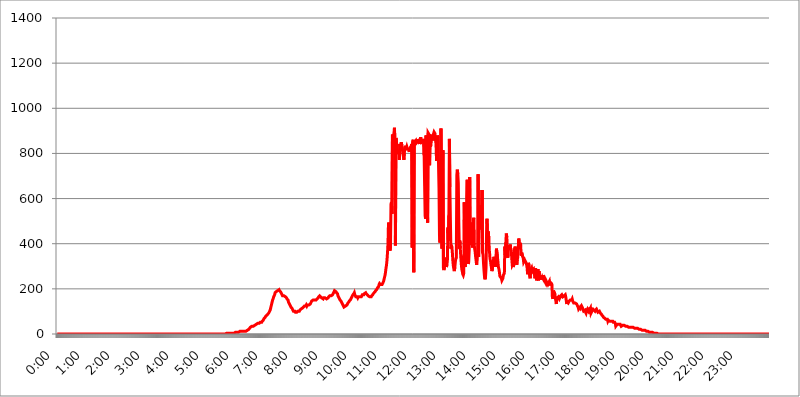
| Category | 2017.07.25. Intenzitás [W/m^2] |
|---|---|
| 0.0 | 0 |
| 0.0006944444444444445 | 0 |
| 0.001388888888888889 | 0 |
| 0.0020833333333333333 | 0 |
| 0.002777777777777778 | 0 |
| 0.003472222222222222 | 0 |
| 0.004166666666666667 | 0 |
| 0.004861111111111111 | 0 |
| 0.005555555555555556 | 0 |
| 0.0062499999999999995 | 0 |
| 0.006944444444444444 | 0 |
| 0.007638888888888889 | 0 |
| 0.008333333333333333 | 0 |
| 0.009027777777777779 | 0 |
| 0.009722222222222222 | 0 |
| 0.010416666666666666 | 0 |
| 0.011111111111111112 | 0 |
| 0.011805555555555555 | 0 |
| 0.012499999999999999 | 0 |
| 0.013194444444444444 | 0 |
| 0.013888888888888888 | 0 |
| 0.014583333333333332 | 0 |
| 0.015277777777777777 | 0 |
| 0.015972222222222224 | 0 |
| 0.016666666666666666 | 0 |
| 0.017361111111111112 | 0 |
| 0.018055555555555557 | 0 |
| 0.01875 | 0 |
| 0.019444444444444445 | 0 |
| 0.02013888888888889 | 0 |
| 0.020833333333333332 | 0 |
| 0.02152777777777778 | 0 |
| 0.022222222222222223 | 0 |
| 0.02291666666666667 | 0 |
| 0.02361111111111111 | 0 |
| 0.024305555555555556 | 0 |
| 0.024999999999999998 | 0 |
| 0.025694444444444447 | 0 |
| 0.02638888888888889 | 0 |
| 0.027083333333333334 | 0 |
| 0.027777777777777776 | 0 |
| 0.02847222222222222 | 0 |
| 0.029166666666666664 | 0 |
| 0.029861111111111113 | 0 |
| 0.030555555555555555 | 0 |
| 0.03125 | 0 |
| 0.03194444444444445 | 0 |
| 0.03263888888888889 | 0 |
| 0.03333333333333333 | 0 |
| 0.034027777777777775 | 0 |
| 0.034722222222222224 | 0 |
| 0.035416666666666666 | 0 |
| 0.036111111111111115 | 0 |
| 0.03680555555555556 | 0 |
| 0.0375 | 0 |
| 0.03819444444444444 | 0 |
| 0.03888888888888889 | 0 |
| 0.03958333333333333 | 0 |
| 0.04027777777777778 | 0 |
| 0.04097222222222222 | 0 |
| 0.041666666666666664 | 0 |
| 0.042361111111111106 | 0 |
| 0.04305555555555556 | 0 |
| 0.043750000000000004 | 0 |
| 0.044444444444444446 | 0 |
| 0.04513888888888889 | 0 |
| 0.04583333333333334 | 0 |
| 0.04652777777777778 | 0 |
| 0.04722222222222222 | 0 |
| 0.04791666666666666 | 0 |
| 0.04861111111111111 | 0 |
| 0.049305555555555554 | 0 |
| 0.049999999999999996 | 0 |
| 0.05069444444444445 | 0 |
| 0.051388888888888894 | 0 |
| 0.052083333333333336 | 0 |
| 0.05277777777777778 | 0 |
| 0.05347222222222222 | 0 |
| 0.05416666666666667 | 0 |
| 0.05486111111111111 | 0 |
| 0.05555555555555555 | 0 |
| 0.05625 | 0 |
| 0.05694444444444444 | 0 |
| 0.057638888888888885 | 0 |
| 0.05833333333333333 | 0 |
| 0.05902777777777778 | 0 |
| 0.059722222222222225 | 0 |
| 0.06041666666666667 | 0 |
| 0.061111111111111116 | 0 |
| 0.06180555555555556 | 0 |
| 0.0625 | 0 |
| 0.06319444444444444 | 0 |
| 0.06388888888888888 | 0 |
| 0.06458333333333334 | 0 |
| 0.06527777777777778 | 0 |
| 0.06597222222222222 | 0 |
| 0.06666666666666667 | 0 |
| 0.06736111111111111 | 0 |
| 0.06805555555555555 | 0 |
| 0.06874999999999999 | 0 |
| 0.06944444444444443 | 0 |
| 0.07013888888888889 | 0 |
| 0.07083333333333333 | 0 |
| 0.07152777777777779 | 0 |
| 0.07222222222222223 | 0 |
| 0.07291666666666667 | 0 |
| 0.07361111111111111 | 0 |
| 0.07430555555555556 | 0 |
| 0.075 | 0 |
| 0.07569444444444444 | 0 |
| 0.0763888888888889 | 0 |
| 0.07708333333333334 | 0 |
| 0.07777777777777778 | 0 |
| 0.07847222222222222 | 0 |
| 0.07916666666666666 | 0 |
| 0.0798611111111111 | 0 |
| 0.08055555555555556 | 0 |
| 0.08125 | 0 |
| 0.08194444444444444 | 0 |
| 0.08263888888888889 | 0 |
| 0.08333333333333333 | 0 |
| 0.08402777777777777 | 0 |
| 0.08472222222222221 | 0 |
| 0.08541666666666665 | 0 |
| 0.08611111111111112 | 0 |
| 0.08680555555555557 | 0 |
| 0.08750000000000001 | 0 |
| 0.08819444444444445 | 0 |
| 0.08888888888888889 | 0 |
| 0.08958333333333333 | 0 |
| 0.09027777777777778 | 0 |
| 0.09097222222222222 | 0 |
| 0.09166666666666667 | 0 |
| 0.09236111111111112 | 0 |
| 0.09305555555555556 | 0 |
| 0.09375 | 0 |
| 0.09444444444444444 | 0 |
| 0.09513888888888888 | 0 |
| 0.09583333333333333 | 0 |
| 0.09652777777777777 | 0 |
| 0.09722222222222222 | 0 |
| 0.09791666666666667 | 0 |
| 0.09861111111111111 | 0 |
| 0.09930555555555555 | 0 |
| 0.09999999999999999 | 0 |
| 0.10069444444444443 | 0 |
| 0.1013888888888889 | 0 |
| 0.10208333333333335 | 0 |
| 0.10277777777777779 | 0 |
| 0.10347222222222223 | 0 |
| 0.10416666666666667 | 0 |
| 0.10486111111111111 | 0 |
| 0.10555555555555556 | 0 |
| 0.10625 | 0 |
| 0.10694444444444444 | 0 |
| 0.1076388888888889 | 0 |
| 0.10833333333333334 | 0 |
| 0.10902777777777778 | 0 |
| 0.10972222222222222 | 0 |
| 0.1111111111111111 | 0 |
| 0.11180555555555556 | 0 |
| 0.11180555555555556 | 0 |
| 0.1125 | 0 |
| 0.11319444444444444 | 0 |
| 0.11388888888888889 | 0 |
| 0.11458333333333333 | 0 |
| 0.11527777777777777 | 0 |
| 0.11597222222222221 | 0 |
| 0.11666666666666665 | 0 |
| 0.1173611111111111 | 0 |
| 0.11805555555555557 | 0 |
| 0.11944444444444445 | 0 |
| 0.12013888888888889 | 0 |
| 0.12083333333333333 | 0 |
| 0.12152777777777778 | 0 |
| 0.12222222222222223 | 0 |
| 0.12291666666666667 | 0 |
| 0.12291666666666667 | 0 |
| 0.12361111111111112 | 0 |
| 0.12430555555555556 | 0 |
| 0.125 | 0 |
| 0.12569444444444444 | 0 |
| 0.12638888888888888 | 0 |
| 0.12708333333333333 | 0 |
| 0.16875 | 0 |
| 0.12847222222222224 | 0 |
| 0.12916666666666668 | 0 |
| 0.12986111111111112 | 0 |
| 0.13055555555555556 | 0 |
| 0.13125 | 0 |
| 0.13194444444444445 | 0 |
| 0.1326388888888889 | 0 |
| 0.13333333333333333 | 0 |
| 0.13402777777777777 | 0 |
| 0.13402777777777777 | 0 |
| 0.13472222222222222 | 0 |
| 0.13541666666666666 | 0 |
| 0.1361111111111111 | 0 |
| 0.13749999999999998 | 0 |
| 0.13819444444444443 | 0 |
| 0.1388888888888889 | 0 |
| 0.13958333333333334 | 0 |
| 0.14027777777777778 | 0 |
| 0.14097222222222222 | 0 |
| 0.14166666666666666 | 0 |
| 0.1423611111111111 | 0 |
| 0.14305555555555557 | 0 |
| 0.14375000000000002 | 0 |
| 0.14444444444444446 | 0 |
| 0.1451388888888889 | 0 |
| 0.1451388888888889 | 0 |
| 0.14652777777777778 | 0 |
| 0.14722222222222223 | 0 |
| 0.14791666666666667 | 0 |
| 0.1486111111111111 | 0 |
| 0.14930555555555555 | 0 |
| 0.15 | 0 |
| 0.15069444444444444 | 0 |
| 0.15138888888888888 | 0 |
| 0.15208333333333332 | 0 |
| 0.15277777777777776 | 0 |
| 0.15347222222222223 | 0 |
| 0.15416666666666667 | 0 |
| 0.15486111111111112 | 0 |
| 0.15555555555555556 | 0 |
| 0.15625 | 0 |
| 0.15694444444444444 | 0 |
| 0.15763888888888888 | 0 |
| 0.15833333333333333 | 0 |
| 0.15902777777777777 | 0 |
| 0.15972222222222224 | 0 |
| 0.16041666666666668 | 0 |
| 0.16111111111111112 | 0 |
| 0.16180555555555556 | 0 |
| 0.1625 | 0 |
| 0.16319444444444445 | 0 |
| 0.1638888888888889 | 0 |
| 0.16458333333333333 | 0 |
| 0.16527777777777777 | 0 |
| 0.16597222222222222 | 0 |
| 0.16666666666666666 | 0 |
| 0.1673611111111111 | 0 |
| 0.16805555555555554 | 0 |
| 0.16874999999999998 | 0 |
| 0.16944444444444443 | 0 |
| 0.17013888888888887 | 0 |
| 0.1708333333333333 | 0 |
| 0.17152777777777775 | 0 |
| 0.17222222222222225 | 0 |
| 0.1729166666666667 | 0 |
| 0.17361111111111113 | 0 |
| 0.17430555555555557 | 0 |
| 0.17500000000000002 | 0 |
| 0.17569444444444446 | 0 |
| 0.1763888888888889 | 0 |
| 0.17708333333333334 | 0 |
| 0.17777777777777778 | 0 |
| 0.17847222222222223 | 0 |
| 0.17916666666666667 | 0 |
| 0.1798611111111111 | 0 |
| 0.18055555555555555 | 0 |
| 0.18125 | 0 |
| 0.18194444444444444 | 0 |
| 0.1826388888888889 | 0 |
| 0.18333333333333335 | 0 |
| 0.1840277777777778 | 0 |
| 0.18472222222222223 | 0 |
| 0.18541666666666667 | 0 |
| 0.18611111111111112 | 0 |
| 0.18680555555555556 | 0 |
| 0.1875 | 0 |
| 0.18819444444444444 | 0 |
| 0.18888888888888888 | 0 |
| 0.18958333333333333 | 0 |
| 0.19027777777777777 | 0 |
| 0.1909722222222222 | 0 |
| 0.19166666666666665 | 0 |
| 0.19236111111111112 | 0 |
| 0.19305555555555554 | 0 |
| 0.19375 | 0 |
| 0.19444444444444445 | 0 |
| 0.1951388888888889 | 0 |
| 0.19583333333333333 | 0 |
| 0.19652777777777777 | 0 |
| 0.19722222222222222 | 0 |
| 0.19791666666666666 | 0 |
| 0.1986111111111111 | 0 |
| 0.19930555555555554 | 0 |
| 0.19999999999999998 | 0 |
| 0.20069444444444443 | 0 |
| 0.20138888888888887 | 0 |
| 0.2020833333333333 | 0 |
| 0.2027777777777778 | 0 |
| 0.2034722222222222 | 0 |
| 0.2041666666666667 | 0 |
| 0.20486111111111113 | 0 |
| 0.20555555555555557 | 0 |
| 0.20625000000000002 | 0 |
| 0.20694444444444446 | 0 |
| 0.2076388888888889 | 0 |
| 0.20833333333333334 | 0 |
| 0.20902777777777778 | 0 |
| 0.20972222222222223 | 0 |
| 0.21041666666666667 | 0 |
| 0.2111111111111111 | 0 |
| 0.21180555555555555 | 0 |
| 0.2125 | 0 |
| 0.21319444444444444 | 0 |
| 0.2138888888888889 | 0 |
| 0.21458333333333335 | 0 |
| 0.2152777777777778 | 0 |
| 0.21597222222222223 | 0 |
| 0.21666666666666667 | 0 |
| 0.21736111111111112 | 0 |
| 0.21805555555555556 | 0 |
| 0.21875 | 0 |
| 0.21944444444444444 | 0 |
| 0.22013888888888888 | 0 |
| 0.22083333333333333 | 0 |
| 0.22152777777777777 | 0 |
| 0.2222222222222222 | 0 |
| 0.22291666666666665 | 0 |
| 0.2236111111111111 | 0 |
| 0.22430555555555556 | 0 |
| 0.225 | 0 |
| 0.22569444444444445 | 0 |
| 0.2263888888888889 | 0 |
| 0.22708333333333333 | 0 |
| 0.22777777777777777 | 0 |
| 0.22847222222222222 | 0 |
| 0.22916666666666666 | 0 |
| 0.2298611111111111 | 0 |
| 0.23055555555555554 | 0 |
| 0.23124999999999998 | 0 |
| 0.23194444444444443 | 0 |
| 0.23263888888888887 | 0 |
| 0.2333333333333333 | 0 |
| 0.2340277777777778 | 0 |
| 0.2347222222222222 | 0 |
| 0.2354166666666667 | 0 |
| 0.23611111111111113 | 0 |
| 0.23680555555555557 | 0 |
| 0.23750000000000002 | 3.525 |
| 0.23819444444444446 | 0 |
| 0.2388888888888889 | 3.525 |
| 0.23958333333333334 | 3.525 |
| 0.24027777777777778 | 3.525 |
| 0.24097222222222223 | 3.525 |
| 0.24166666666666667 | 3.525 |
| 0.2423611111111111 | 3.525 |
| 0.24305555555555555 | 3.525 |
| 0.24375 | 3.525 |
| 0.24444444444444446 | 3.525 |
| 0.24513888888888888 | 3.525 |
| 0.24583333333333335 | 3.525 |
| 0.2465277777777778 | 3.525 |
| 0.24722222222222223 | 3.525 |
| 0.24791666666666667 | 3.525 |
| 0.24861111111111112 | 3.525 |
| 0.24930555555555556 | 3.525 |
| 0.25 | 7.887 |
| 0.25069444444444444 | 7.887 |
| 0.2513888888888889 | 7.887 |
| 0.2520833333333333 | 7.887 |
| 0.25277777777777777 | 7.887 |
| 0.2534722222222222 | 7.887 |
| 0.25416666666666665 | 7.887 |
| 0.2548611111111111 | 7.887 |
| 0.2555555555555556 | 12.257 |
| 0.25625000000000003 | 12.257 |
| 0.2569444444444445 | 12.257 |
| 0.2576388888888889 | 12.257 |
| 0.25833333333333336 | 12.257 |
| 0.2590277777777778 | 12.257 |
| 0.25972222222222224 | 12.257 |
| 0.2604166666666667 | 12.257 |
| 0.2611111111111111 | 12.257 |
| 0.26180555555555557 | 12.257 |
| 0.2625 | 12.257 |
| 0.26319444444444445 | 12.257 |
| 0.2638888888888889 | 12.257 |
| 0.26458333333333334 | 12.257 |
| 0.2652777777777778 | 12.257 |
| 0.2659722222222222 | 16.636 |
| 0.26666666666666666 | 16.636 |
| 0.2673611111111111 | 21.024 |
| 0.26805555555555555 | 21.024 |
| 0.26875 | 21.024 |
| 0.26944444444444443 | 25.419 |
| 0.2701388888888889 | 25.419 |
| 0.2708333333333333 | 29.823 |
| 0.27152777777777776 | 29.823 |
| 0.2722222222222222 | 29.823 |
| 0.27291666666666664 | 34.234 |
| 0.2736111111111111 | 34.234 |
| 0.2743055555555555 | 34.234 |
| 0.27499999999999997 | 34.234 |
| 0.27569444444444446 | 38.653 |
| 0.27638888888888885 | 38.653 |
| 0.27708333333333335 | 38.653 |
| 0.2777777777777778 | 38.653 |
| 0.27847222222222223 | 38.653 |
| 0.2791666666666667 | 43.079 |
| 0.2798611111111111 | 43.079 |
| 0.28055555555555556 | 43.079 |
| 0.28125 | 47.511 |
| 0.28194444444444444 | 47.511 |
| 0.2826388888888889 | 47.511 |
| 0.2833333333333333 | 47.511 |
| 0.28402777777777777 | 47.511 |
| 0.2847222222222222 | 51.951 |
| 0.28541666666666665 | 51.951 |
| 0.28611111111111115 | 51.951 |
| 0.28680555555555554 | 51.951 |
| 0.28750000000000003 | 56.398 |
| 0.2881944444444445 | 56.398 |
| 0.2888888888888889 | 60.85 |
| 0.28958333333333336 | 65.31 |
| 0.2902777777777778 | 69.775 |
| 0.29097222222222224 | 69.775 |
| 0.2916666666666667 | 74.246 |
| 0.2923611111111111 | 78.722 |
| 0.29305555555555557 | 78.722 |
| 0.29375 | 83.205 |
| 0.29444444444444445 | 83.205 |
| 0.2951388888888889 | 87.692 |
| 0.29583333333333334 | 87.692 |
| 0.2965277777777778 | 92.184 |
| 0.2972222222222222 | 96.682 |
| 0.29791666666666666 | 101.184 |
| 0.2986111111111111 | 105.69 |
| 0.29930555555555555 | 114.716 |
| 0.3 | 123.758 |
| 0.30069444444444443 | 132.814 |
| 0.3013888888888889 | 141.884 |
| 0.3020833333333333 | 150.964 |
| 0.30277777777777776 | 155.509 |
| 0.3034722222222222 | 164.605 |
| 0.30416666666666664 | 169.156 |
| 0.3048611111111111 | 173.709 |
| 0.3055555555555555 | 182.82 |
| 0.30624999999999997 | 182.82 |
| 0.3069444444444444 | 187.378 |
| 0.3076388888888889 | 187.378 |
| 0.30833333333333335 | 187.378 |
| 0.3090277777777778 | 191.937 |
| 0.30972222222222223 | 191.937 |
| 0.3104166666666667 | 191.937 |
| 0.3111111111111111 | 196.497 |
| 0.31180555555555556 | 191.937 |
| 0.3125 | 191.937 |
| 0.31319444444444444 | 187.378 |
| 0.3138888888888889 | 182.82 |
| 0.3145833333333333 | 178.264 |
| 0.31527777777777777 | 173.709 |
| 0.3159722222222222 | 169.156 |
| 0.31666666666666665 | 169.156 |
| 0.31736111111111115 | 169.156 |
| 0.31805555555555554 | 169.156 |
| 0.31875000000000003 | 169.156 |
| 0.3194444444444445 | 169.156 |
| 0.3201388888888889 | 164.605 |
| 0.32083333333333336 | 164.605 |
| 0.3215277777777778 | 160.056 |
| 0.32222222222222224 | 155.509 |
| 0.3229166666666667 | 155.509 |
| 0.3236111111111111 | 150.964 |
| 0.32430555555555557 | 141.884 |
| 0.325 | 137.347 |
| 0.32569444444444445 | 132.814 |
| 0.3263888888888889 | 128.284 |
| 0.32708333333333334 | 123.758 |
| 0.3277777777777778 | 119.235 |
| 0.3284722222222222 | 119.235 |
| 0.32916666666666666 | 114.716 |
| 0.3298611111111111 | 110.201 |
| 0.33055555555555555 | 105.69 |
| 0.33125 | 101.184 |
| 0.33194444444444443 | 101.184 |
| 0.3326388888888889 | 101.184 |
| 0.3333333333333333 | 101.184 |
| 0.3340277777777778 | 96.682 |
| 0.3347222222222222 | 96.682 |
| 0.3354166666666667 | 96.682 |
| 0.3361111111111111 | 96.682 |
| 0.3368055555555556 | 96.682 |
| 0.33749999999999997 | 101.184 |
| 0.33819444444444446 | 101.184 |
| 0.33888888888888885 | 101.184 |
| 0.33958333333333335 | 101.184 |
| 0.34027777777777773 | 105.69 |
| 0.34097222222222223 | 105.69 |
| 0.3416666666666666 | 110.201 |
| 0.3423611111111111 | 110.201 |
| 0.3430555555555555 | 110.201 |
| 0.34375 | 114.716 |
| 0.3444444444444445 | 114.716 |
| 0.3451388888888889 | 119.235 |
| 0.3458333333333334 | 119.235 |
| 0.34652777777777777 | 123.758 |
| 0.34722222222222227 | 123.758 |
| 0.34791666666666665 | 123.758 |
| 0.34861111111111115 | 123.758 |
| 0.34930555555555554 | 128.284 |
| 0.35000000000000003 | 123.758 |
| 0.3506944444444444 | 128.284 |
| 0.3513888888888889 | 128.284 |
| 0.3520833333333333 | 128.284 |
| 0.3527777777777778 | 128.284 |
| 0.3534722222222222 | 128.284 |
| 0.3541666666666667 | 128.284 |
| 0.3548611111111111 | 132.814 |
| 0.35555555555555557 | 137.347 |
| 0.35625 | 141.884 |
| 0.35694444444444445 | 146.423 |
| 0.3576388888888889 | 146.423 |
| 0.35833333333333334 | 146.423 |
| 0.3590277777777778 | 150.964 |
| 0.3597222222222222 | 150.964 |
| 0.36041666666666666 | 150.964 |
| 0.3611111111111111 | 150.964 |
| 0.36180555555555555 | 150.964 |
| 0.3625 | 150.964 |
| 0.36319444444444443 | 150.964 |
| 0.3638888888888889 | 150.964 |
| 0.3645833333333333 | 155.509 |
| 0.3652777777777778 | 155.509 |
| 0.3659722222222222 | 160.056 |
| 0.3666666666666667 | 164.605 |
| 0.3673611111111111 | 164.605 |
| 0.3680555555555556 | 169.156 |
| 0.36874999999999997 | 169.156 |
| 0.36944444444444446 | 164.605 |
| 0.37013888888888885 | 164.605 |
| 0.37083333333333335 | 160.056 |
| 0.37152777777777773 | 160.056 |
| 0.37222222222222223 | 160.056 |
| 0.3729166666666666 | 155.509 |
| 0.3736111111111111 | 160.056 |
| 0.3743055555555555 | 160.056 |
| 0.375 | 160.056 |
| 0.3756944444444445 | 160.056 |
| 0.3763888888888889 | 160.056 |
| 0.3770833333333334 | 160.056 |
| 0.37777777777777777 | 155.509 |
| 0.37847222222222227 | 155.509 |
| 0.37916666666666665 | 155.509 |
| 0.37986111111111115 | 160.056 |
| 0.38055555555555554 | 164.605 |
| 0.38125000000000003 | 164.605 |
| 0.3819444444444444 | 169.156 |
| 0.3826388888888889 | 169.156 |
| 0.3833333333333333 | 169.156 |
| 0.3840277777777778 | 169.156 |
| 0.3847222222222222 | 169.156 |
| 0.3854166666666667 | 169.156 |
| 0.3861111111111111 | 173.709 |
| 0.38680555555555557 | 178.264 |
| 0.3875 | 182.82 |
| 0.38819444444444445 | 187.378 |
| 0.3888888888888889 | 191.937 |
| 0.38958333333333334 | 191.937 |
| 0.3902777777777778 | 191.937 |
| 0.3909722222222222 | 187.378 |
| 0.39166666666666666 | 182.82 |
| 0.3923611111111111 | 182.82 |
| 0.39305555555555555 | 178.264 |
| 0.39375 | 169.156 |
| 0.39444444444444443 | 164.605 |
| 0.3951388888888889 | 160.056 |
| 0.3958333333333333 | 155.509 |
| 0.3965277777777778 | 150.964 |
| 0.3972222222222222 | 150.964 |
| 0.3979166666666667 | 146.423 |
| 0.3986111111111111 | 141.884 |
| 0.3993055555555556 | 137.347 |
| 0.39999999999999997 | 132.814 |
| 0.40069444444444446 | 128.284 |
| 0.40138888888888885 | 123.758 |
| 0.40208333333333335 | 119.235 |
| 0.40277777777777773 | 119.235 |
| 0.40347222222222223 | 119.235 |
| 0.4041666666666666 | 123.758 |
| 0.4048611111111111 | 123.758 |
| 0.4055555555555555 | 123.758 |
| 0.40625 | 128.284 |
| 0.4069444444444445 | 132.814 |
| 0.4076388888888889 | 137.347 |
| 0.4083333333333334 | 137.347 |
| 0.40902777777777777 | 141.884 |
| 0.40972222222222227 | 146.423 |
| 0.41041666666666665 | 146.423 |
| 0.41111111111111115 | 150.964 |
| 0.41180555555555554 | 155.509 |
| 0.41250000000000003 | 160.056 |
| 0.4131944444444444 | 164.605 |
| 0.4138888888888889 | 169.156 |
| 0.4145833333333333 | 173.709 |
| 0.4152777777777778 | 173.709 |
| 0.4159722222222222 | 178.264 |
| 0.4166666666666667 | 182.82 |
| 0.4173611111111111 | 173.709 |
| 0.41805555555555557 | 169.156 |
| 0.41875 | 164.605 |
| 0.41944444444444445 | 164.605 |
| 0.4201388888888889 | 164.605 |
| 0.42083333333333334 | 164.605 |
| 0.4215277777777778 | 160.056 |
| 0.4222222222222222 | 164.605 |
| 0.42291666666666666 | 164.605 |
| 0.4236111111111111 | 164.605 |
| 0.42430555555555555 | 164.605 |
| 0.425 | 164.605 |
| 0.42569444444444443 | 164.605 |
| 0.4263888888888889 | 164.605 |
| 0.4270833333333333 | 169.156 |
| 0.4277777777777778 | 173.709 |
| 0.4284722222222222 | 173.709 |
| 0.4291666666666667 | 173.709 |
| 0.4298611111111111 | 173.709 |
| 0.4305555555555556 | 178.264 |
| 0.43124999999999997 | 178.264 |
| 0.43194444444444446 | 178.264 |
| 0.43263888888888885 | 182.82 |
| 0.43333333333333335 | 178.264 |
| 0.43402777777777773 | 178.264 |
| 0.43472222222222223 | 173.709 |
| 0.4354166666666666 | 173.709 |
| 0.4361111111111111 | 169.156 |
| 0.4368055555555555 | 169.156 |
| 0.4375 | 169.156 |
| 0.4381944444444445 | 164.605 |
| 0.4388888888888889 | 164.605 |
| 0.4395833333333334 | 164.605 |
| 0.44027777777777777 | 164.605 |
| 0.44097222222222227 | 169.156 |
| 0.44166666666666665 | 169.156 |
| 0.44236111111111115 | 173.709 |
| 0.44305555555555554 | 178.264 |
| 0.44375000000000003 | 178.264 |
| 0.4444444444444444 | 182.82 |
| 0.4451388888888889 | 182.82 |
| 0.4458333333333333 | 187.378 |
| 0.4465277777777778 | 191.937 |
| 0.4472222222222222 | 191.937 |
| 0.4479166666666667 | 196.497 |
| 0.4486111111111111 | 201.058 |
| 0.44930555555555557 | 205.62 |
| 0.45 | 205.62 |
| 0.45069444444444445 | 210.182 |
| 0.4513888888888889 | 219.309 |
| 0.45208333333333334 | 223.873 |
| 0.4527777777777778 | 223.873 |
| 0.4534722222222222 | 219.309 |
| 0.45416666666666666 | 219.309 |
| 0.4548611111111111 | 219.309 |
| 0.45555555555555555 | 219.309 |
| 0.45625 | 223.873 |
| 0.45694444444444443 | 228.436 |
| 0.4576388888888889 | 233 |
| 0.4583333333333333 | 242.127 |
| 0.4590277777777778 | 251.251 |
| 0.4597222222222222 | 260.373 |
| 0.4604166666666667 | 274.047 |
| 0.4611111111111111 | 292.259 |
| 0.4618055555555556 | 305.898 |
| 0.46249999999999997 | 328.584 |
| 0.46319444444444446 | 360.221 |
| 0.46388888888888885 | 400.638 |
| 0.46458333333333335 | 493.475 |
| 0.46527777777777773 | 431.833 |
| 0.46597222222222223 | 400.638 |
| 0.4666666666666666 | 369.23 |
| 0.4673611111111111 | 387.202 |
| 0.4680555555555555 | 575.299 |
| 0.46875 | 583.779 |
| 0.4694444444444445 | 532.513 |
| 0.4701388888888889 | 883.516 |
| 0.4708333333333334 | 883.516 |
| 0.47152777777777777 | 868.305 |
| 0.47222222222222227 | 887.309 |
| 0.47291666666666665 | 913.766 |
| 0.47361111111111115 | 853.029 |
| 0.47430555555555554 | 391.685 |
| 0.47500000000000003 | 868.305 |
| 0.4756944444444444 | 853.029 |
| 0.4763888888888889 | 833.834 |
| 0.4770833333333333 | 837.682 |
| 0.4777777777777778 | 798.974 |
| 0.4784722222222222 | 806.757 |
| 0.4791666666666667 | 814.519 |
| 0.4798611111111111 | 771.559 |
| 0.48055555555555557 | 841.526 |
| 0.48125 | 829.981 |
| 0.48194444444444445 | 829.981 |
| 0.4826388888888889 | 849.199 |
| 0.48333333333333334 | 833.834 |
| 0.4840277777777778 | 822.26 |
| 0.4847222222222222 | 798.974 |
| 0.48541666666666666 | 787.258 |
| 0.4861111111111111 | 771.559 |
| 0.48680555555555555 | 802.868 |
| 0.4875 | 826.123 |
| 0.48819444444444443 | 833.834 |
| 0.4888888888888889 | 814.519 |
| 0.4895833333333333 | 810.641 |
| 0.4902777777777778 | 829.981 |
| 0.4909722222222222 | 822.26 |
| 0.4916666666666667 | 822.26 |
| 0.4923611111111111 | 826.123 |
| 0.4930555555555556 | 814.519 |
| 0.49374999999999997 | 806.757 |
| 0.49444444444444446 | 822.26 |
| 0.49513888888888885 | 826.123 |
| 0.49583333333333335 | 826.123 |
| 0.49652777777777773 | 833.834 |
| 0.49722222222222223 | 841.526 |
| 0.4979166666666666 | 382.715 |
| 0.4986111111111111 | 853.029 |
| 0.4993055555555555 | 860.676 |
| 0.5 | 274.047 |
| 0.5006944444444444 | 849.199 |
| 0.5013888888888889 | 849.199 |
| 0.5020833333333333 | 845.365 |
| 0.5027777777777778 | 856.855 |
| 0.5034722222222222 | 845.365 |
| 0.5041666666666667 | 845.365 |
| 0.5048611111111111 | 845.365 |
| 0.5055555555555555 | 853.029 |
| 0.50625 | 864.493 |
| 0.5069444444444444 | 853.029 |
| 0.5076388888888889 | 860.676 |
| 0.5083333333333333 | 841.526 |
| 0.5090277777777777 | 860.676 |
| 0.5097222222222222 | 872.114 |
| 0.5104166666666666 | 856.855 |
| 0.5111111111111112 | 849.199 |
| 0.5118055555555555 | 845.365 |
| 0.5125000000000001 | 849.199 |
| 0.5131944444444444 | 853.029 |
| 0.513888888888889 | 864.493 |
| 0.5145833333333333 | 791.169 |
| 0.5152777777777778 | 654.791 |
| 0.5159722222222222 | 523.88 |
| 0.5166666666666667 | 510.885 |
| 0.517361111111111 | 879.719 |
| 0.5180555555555556 | 879.719 |
| 0.5187499999999999 | 883.516 |
| 0.5194444444444445 | 493.475 |
| 0.5201388888888888 | 891.099 |
| 0.5208333333333334 | 891.099 |
| 0.5215277777777778 | 883.516 |
| 0.5222222222222223 | 747.834 |
| 0.5229166666666667 | 883.516 |
| 0.5236111111111111 | 829.981 |
| 0.5243055555555556 | 856.855 |
| 0.525 | 879.719 |
| 0.5256944444444445 | 856.855 |
| 0.5263888888888889 | 868.305 |
| 0.5270833333333333 | 879.719 |
| 0.5277777777777778 | 887.309 |
| 0.5284722222222222 | 894.885 |
| 0.5291666666666667 | 894.885 |
| 0.5298611111111111 | 887.309 |
| 0.5305555555555556 | 856.855 |
| 0.53125 | 841.526 |
| 0.5319444444444444 | 767.62 |
| 0.5326388888888889 | 814.519 |
| 0.5333333333333333 | 879.719 |
| 0.5340277777777778 | 868.305 |
| 0.5347222222222222 | 755.766 |
| 0.5354166666666667 | 646.537 |
| 0.5361111111111111 | 436.27 |
| 0.5368055555555555 | 405.108 |
| 0.5375 | 634.105 |
| 0.5381944444444444 | 909.996 |
| 0.5388888888888889 | 658.909 |
| 0.5395833333333333 | 378.224 |
| 0.5402777777777777 | 699.717 |
| 0.5409722222222222 | 814.519 |
| 0.5416666666666666 | 292.259 |
| 0.5423611111111112 | 283.156 |
| 0.5430555555555555 | 296.808 |
| 0.5437500000000001 | 337.639 |
| 0.5444444444444444 | 333.113 |
| 0.545138888888889 | 305.898 |
| 0.5458333333333333 | 296.808 |
| 0.5465277777777778 | 305.898 |
| 0.5472222222222222 | 328.584 |
| 0.5479166666666667 | 471.582 |
| 0.548611111111111 | 414.035 |
| 0.5493055555555556 | 528.2 |
| 0.5499999999999999 | 864.493 |
| 0.5506944444444445 | 650.667 |
| 0.5513888888888888 | 506.542 |
| 0.5520833333333334 | 378.224 |
| 0.5527777777777778 | 391.685 |
| 0.5534722222222223 | 387.202 |
| 0.5541666666666667 | 360.221 |
| 0.5548611111111111 | 324.052 |
| 0.5555555555555556 | 301.354 |
| 0.55625 | 287.709 |
| 0.5569444444444445 | 278.603 |
| 0.5576388888888889 | 296.808 |
| 0.5583333333333333 | 319.517 |
| 0.5590277777777778 | 333.113 |
| 0.5597222222222222 | 337.639 |
| 0.5604166666666667 | 703.762 |
| 0.5611111111111111 | 727.896 |
| 0.5618055555555556 | 707.8 |
| 0.5625 | 667.123 |
| 0.5631944444444444 | 493.475 |
| 0.5638888888888889 | 378.224 |
| 0.5645833333333333 | 414.035 |
| 0.5652777777777778 | 378.224 |
| 0.5659722222222222 | 342.162 |
| 0.5666666666666667 | 310.44 |
| 0.5673611111111111 | 287.709 |
| 0.5680555555555555 | 278.603 |
| 0.56875 | 264.932 |
| 0.5694444444444444 | 260.373 |
| 0.5701388888888889 | 269.49 |
| 0.5708333333333333 | 583.779 |
| 0.5715277777777777 | 324.052 |
| 0.5722222222222222 | 296.808 |
| 0.5729166666666666 | 333.113 |
| 0.5736111111111112 | 373.729 |
| 0.5743055555555555 | 609.062 |
| 0.5750000000000001 | 683.473 |
| 0.5756944444444444 | 342.162 |
| 0.576388888888889 | 310.44 |
| 0.5770833333333333 | 319.517 |
| 0.5777777777777778 | 373.729 |
| 0.5784722222222222 | 695.666 |
| 0.5791666666666667 | 396.164 |
| 0.579861111111111 | 396.164 |
| 0.5805555555555556 | 409.574 |
| 0.5812499999999999 | 493.475 |
| 0.5819444444444445 | 396.164 |
| 0.5826388888888888 | 382.715 |
| 0.5833333333333334 | 422.943 |
| 0.5840277777777778 | 515.223 |
| 0.5847222222222223 | 396.164 |
| 0.5854166666666667 | 378.224 |
| 0.5861111111111111 | 364.728 |
| 0.5868055555555556 | 342.162 |
| 0.5875 | 324.052 |
| 0.5881944444444445 | 305.898 |
| 0.5888888888888889 | 342.162 |
| 0.5895833333333333 | 355.712 |
| 0.5902777777777778 | 707.8 |
| 0.5909722222222222 | 342.162 |
| 0.5916666666666667 | 571.049 |
| 0.5923611111111111 | 475.972 |
| 0.5930555555555556 | 536.82 |
| 0.59375 | 545.416 |
| 0.5944444444444444 | 519.555 |
| 0.5951388888888889 | 462.786 |
| 0.5958333333333333 | 638.256 |
| 0.5965277777777778 | 360.221 |
| 0.5972222222222222 | 351.198 |
| 0.5979166666666667 | 310.44 |
| 0.5986111111111111 | 278.603 |
| 0.5993055555555555 | 251.251 |
| 0.6 | 242.127 |
| 0.6006944444444444 | 255.813 |
| 0.6013888888888889 | 292.259 |
| 0.6020833333333333 | 440.702 |
| 0.6027777777777777 | 510.885 |
| 0.6034722222222222 | 400.638 |
| 0.6041666666666666 | 414.035 |
| 0.6048611111111112 | 453.968 |
| 0.6055555555555555 | 369.23 |
| 0.6062500000000001 | 364.728 |
| 0.6069444444444444 | 333.113 |
| 0.607638888888889 | 324.052 |
| 0.6083333333333333 | 305.898 |
| 0.6090277777777778 | 292.259 |
| 0.6097222222222222 | 278.603 |
| 0.6104166666666667 | 292.259 |
| 0.611111111111111 | 314.98 |
| 0.6118055555555556 | 328.584 |
| 0.6124999999999999 | 342.162 |
| 0.6131944444444445 | 328.584 |
| 0.6138888888888888 | 337.639 |
| 0.6145833333333334 | 296.808 |
| 0.6152777777777778 | 337.639 |
| 0.6159722222222223 | 378.224 |
| 0.6166666666666667 | 378.224 |
| 0.6173611111111111 | 342.162 |
| 0.6180555555555556 | 319.517 |
| 0.61875 | 296.808 |
| 0.6194444444444445 | 287.709 |
| 0.6201388888888889 | 274.047 |
| 0.6208333333333333 | 255.813 |
| 0.6215277777777778 | 255.813 |
| 0.6222222222222222 | 255.813 |
| 0.6229166666666667 | 246.689 |
| 0.6236111111111111 | 237.564 |
| 0.6243055555555556 | 237.564 |
| 0.625 | 246.689 |
| 0.6256944444444444 | 260.373 |
| 0.6263888888888889 | 264.932 |
| 0.6270833333333333 | 269.49 |
| 0.6277777777777778 | 387.202 |
| 0.6284722222222222 | 351.198 |
| 0.6291666666666667 | 405.108 |
| 0.6298611111111111 | 445.129 |
| 0.6305555555555555 | 427.39 |
| 0.63125 | 351.198 |
| 0.6319444444444444 | 337.639 |
| 0.6326388888888889 | 391.685 |
| 0.6333333333333333 | 387.202 |
| 0.6340277777777777 | 373.729 |
| 0.6347222222222222 | 373.729 |
| 0.6354166666666666 | 396.164 |
| 0.6361111111111112 | 373.729 |
| 0.6368055555555555 | 369.23 |
| 0.6375000000000001 | 333.113 |
| 0.6381944444444444 | 305.898 |
| 0.638888888888889 | 310.44 |
| 0.6395833333333333 | 296.808 |
| 0.6402777777777778 | 305.898 |
| 0.6409722222222222 | 373.729 |
| 0.6416666666666667 | 373.729 |
| 0.642361111111111 | 387.202 |
| 0.6430555555555556 | 369.23 |
| 0.6437499999999999 | 337.639 |
| 0.6444444444444445 | 305.898 |
| 0.6451388888888888 | 328.584 |
| 0.6458333333333334 | 337.639 |
| 0.6465277777777778 | 378.224 |
| 0.6472222222222223 | 422.943 |
| 0.6479166666666667 | 422.943 |
| 0.6486111111111111 | 387.202 |
| 0.6493055555555556 | 387.202 |
| 0.65 | 391.685 |
| 0.6506944444444445 | 346.682 |
| 0.6513888888888889 | 360.221 |
| 0.6520833333333333 | 360.221 |
| 0.6527777777777778 | 342.162 |
| 0.6534722222222222 | 337.639 |
| 0.6541666666666667 | 319.517 |
| 0.6548611111111111 | 319.517 |
| 0.6555555555555556 | 328.584 |
| 0.65625 | 324.052 |
| 0.6569444444444444 | 319.517 |
| 0.6576388888888889 | 314.98 |
| 0.6583333333333333 | 305.898 |
| 0.6590277777777778 | 292.259 |
| 0.6597222222222222 | 264.932 |
| 0.6604166666666667 | 314.98 |
| 0.6611111111111111 | 314.98 |
| 0.6618055555555555 | 305.898 |
| 0.6625 | 260.373 |
| 0.6631944444444444 | 246.689 |
| 0.6638888888888889 | 283.156 |
| 0.6645833333333333 | 287.709 |
| 0.6652777777777777 | 292.259 |
| 0.6659722222222222 | 278.603 |
| 0.6666666666666666 | 283.156 |
| 0.6673611111111111 | 283.156 |
| 0.6680555555555556 | 287.709 |
| 0.6687500000000001 | 287.709 |
| 0.6694444444444444 | 287.709 |
| 0.6701388888888888 | 246.689 |
| 0.6708333333333334 | 292.259 |
| 0.6715277777777778 | 269.49 |
| 0.6722222222222222 | 237.564 |
| 0.6729166666666666 | 264.932 |
| 0.6736111111111112 | 278.603 |
| 0.6743055555555556 | 287.709 |
| 0.6749999999999999 | 237.564 |
| 0.6756944444444444 | 278.603 |
| 0.6763888888888889 | 242.127 |
| 0.6770833333333334 | 251.251 |
| 0.6777777777777777 | 260.373 |
| 0.6784722222222223 | 242.127 |
| 0.6791666666666667 | 251.251 |
| 0.6798611111111111 | 242.127 |
| 0.6805555555555555 | 251.251 |
| 0.68125 | 246.689 |
| 0.6819444444444445 | 260.373 |
| 0.6826388888888889 | 260.373 |
| 0.6833333333333332 | 246.689 |
| 0.6840277777777778 | 246.689 |
| 0.6847222222222222 | 228.436 |
| 0.6854166666666667 | 223.873 |
| 0.686111111111111 | 233 |
| 0.6868055555555556 | 228.436 |
| 0.6875 | 223.873 |
| 0.6881944444444444 | 219.309 |
| 0.688888888888889 | 223.873 |
| 0.6895833333333333 | 223.873 |
| 0.6902777777777778 | 233 |
| 0.6909722222222222 | 214.746 |
| 0.6916666666666668 | 228.436 |
| 0.6923611111111111 | 228.436 |
| 0.6930555555555555 | 223.873 |
| 0.69375 | 219.309 |
| 0.6944444444444445 | 164.605 |
| 0.6951388888888889 | 155.509 |
| 0.6958333333333333 | 191.937 |
| 0.6965277777777777 | 191.937 |
| 0.6972222222222223 | 191.937 |
| 0.6979166666666666 | 178.264 |
| 0.6986111111111111 | 160.056 |
| 0.6993055555555556 | 160.056 |
| 0.7000000000000001 | 132.814 |
| 0.7006944444444444 | 164.605 |
| 0.7013888888888888 | 160.056 |
| 0.7020833333333334 | 160.056 |
| 0.7027777777777778 | 164.605 |
| 0.7034722222222222 | 164.605 |
| 0.7041666666666666 | 155.509 |
| 0.7048611111111112 | 160.056 |
| 0.7055555555555556 | 164.605 |
| 0.7062499999999999 | 169.156 |
| 0.7069444444444444 | 169.156 |
| 0.7076388888888889 | 173.709 |
| 0.7083333333333334 | 169.156 |
| 0.7090277777777777 | 164.605 |
| 0.7097222222222223 | 164.605 |
| 0.7104166666666667 | 164.605 |
| 0.7111111111111111 | 169.156 |
| 0.7118055555555555 | 169.156 |
| 0.7125 | 173.709 |
| 0.7131944444444445 | 164.605 |
| 0.7138888888888889 | 164.605 |
| 0.7145833333333332 | 132.814 |
| 0.7152777777777778 | 141.884 |
| 0.7159722222222222 | 141.884 |
| 0.7166666666666667 | 137.347 |
| 0.717361111111111 | 137.347 |
| 0.7180555555555556 | 146.423 |
| 0.71875 | 146.423 |
| 0.7194444444444444 | 150.964 |
| 0.720138888888889 | 150.964 |
| 0.7208333333333333 | 150.964 |
| 0.7215277777777778 | 150.964 |
| 0.7222222222222222 | 155.509 |
| 0.7229166666666668 | 146.423 |
| 0.7236111111111111 | 141.884 |
| 0.7243055555555555 | 137.347 |
| 0.725 | 137.347 |
| 0.7256944444444445 | 137.347 |
| 0.7263888888888889 | 137.347 |
| 0.7270833333333333 | 137.347 |
| 0.7277777777777777 | 137.347 |
| 0.7284722222222223 | 132.814 |
| 0.7291666666666666 | 128.284 |
| 0.7298611111111111 | 128.284 |
| 0.7305555555555556 | 119.235 |
| 0.7312500000000001 | 110.201 |
| 0.7319444444444444 | 110.201 |
| 0.7326388888888888 | 110.201 |
| 0.7333333333333334 | 119.235 |
| 0.7340277777777778 | 114.716 |
| 0.7347222222222222 | 119.235 |
| 0.7354166666666666 | 110.201 |
| 0.7361111111111112 | 119.235 |
| 0.7368055555555556 | 114.716 |
| 0.7374999999999999 | 105.69 |
| 0.7381944444444444 | 101.184 |
| 0.7388888888888889 | 101.184 |
| 0.7395833333333334 | 101.184 |
| 0.7402777777777777 | 105.69 |
| 0.7409722222222223 | 96.682 |
| 0.7416666666666667 | 92.184 |
| 0.7423611111111111 | 101.184 |
| 0.7430555555555555 | 105.69 |
| 0.74375 | 110.201 |
| 0.7444444444444445 | 110.201 |
| 0.7451388888888889 | 101.184 |
| 0.7458333333333332 | 105.69 |
| 0.7465277777777778 | 101.184 |
| 0.7472222222222222 | 110.201 |
| 0.7479166666666667 | 114.716 |
| 0.748611111111111 | 92.184 |
| 0.7493055555555556 | 96.682 |
| 0.75 | 105.69 |
| 0.7506944444444444 | 105.69 |
| 0.751388888888889 | 110.201 |
| 0.7520833333333333 | 110.201 |
| 0.7527777777777778 | 105.69 |
| 0.7534722222222222 | 105.69 |
| 0.7541666666666668 | 101.184 |
| 0.7548611111111111 | 105.69 |
| 0.7555555555555555 | 105.69 |
| 0.75625 | 110.201 |
| 0.7569444444444445 | 105.69 |
| 0.7576388888888889 | 101.184 |
| 0.7583333333333333 | 96.682 |
| 0.7590277777777777 | 96.682 |
| 0.7597222222222223 | 96.682 |
| 0.7604166666666666 | 101.184 |
| 0.7611111111111111 | 96.682 |
| 0.7618055555555556 | 92.184 |
| 0.7625000000000001 | 92.184 |
| 0.7631944444444444 | 87.692 |
| 0.7638888888888888 | 83.205 |
| 0.7645833333333334 | 83.205 |
| 0.7652777777777778 | 78.722 |
| 0.7659722222222222 | 74.246 |
| 0.7666666666666666 | 74.246 |
| 0.7673611111111112 | 74.246 |
| 0.7680555555555556 | 69.775 |
| 0.7687499999999999 | 69.775 |
| 0.7694444444444444 | 65.31 |
| 0.7701388888888889 | 65.31 |
| 0.7708333333333334 | 65.31 |
| 0.7715277777777777 | 65.31 |
| 0.7722222222222223 | 56.398 |
| 0.7729166666666667 | 60.85 |
| 0.7736111111111111 | 60.85 |
| 0.7743055555555555 | 60.85 |
| 0.775 | 56.398 |
| 0.7756944444444445 | 56.398 |
| 0.7763888888888889 | 56.398 |
| 0.7770833333333332 | 56.398 |
| 0.7777777777777778 | 56.398 |
| 0.7784722222222222 | 56.398 |
| 0.7791666666666667 | 56.398 |
| 0.779861111111111 | 51.951 |
| 0.7805555555555556 | 51.951 |
| 0.78125 | 51.951 |
| 0.7819444444444444 | 51.951 |
| 0.782638888888889 | 47.511 |
| 0.7833333333333333 | 34.234 |
| 0.7840277777777778 | 34.234 |
| 0.7847222222222222 | 29.823 |
| 0.7854166666666668 | 43.079 |
| 0.7861111111111111 | 43.079 |
| 0.7868055555555555 | 43.079 |
| 0.7875 | 43.079 |
| 0.7881944444444445 | 43.079 |
| 0.7888888888888889 | 43.079 |
| 0.7895833333333333 | 43.079 |
| 0.7902777777777777 | 38.653 |
| 0.7909722222222223 | 34.234 |
| 0.7916666666666666 | 38.653 |
| 0.7923611111111111 | 38.653 |
| 0.7930555555555556 | 38.653 |
| 0.7937500000000001 | 38.653 |
| 0.7944444444444444 | 38.653 |
| 0.7951388888888888 | 38.653 |
| 0.7958333333333334 | 38.653 |
| 0.7965277777777778 | 34.234 |
| 0.7972222222222222 | 34.234 |
| 0.7979166666666666 | 34.234 |
| 0.7986111111111112 | 34.234 |
| 0.7993055555555556 | 34.234 |
| 0.7999999999999999 | 34.234 |
| 0.8006944444444444 | 34.234 |
| 0.8013888888888889 | 29.823 |
| 0.8020833333333334 | 29.823 |
| 0.8027777777777777 | 29.823 |
| 0.8034722222222223 | 29.823 |
| 0.8041666666666667 | 29.823 |
| 0.8048611111111111 | 29.823 |
| 0.8055555555555555 | 29.823 |
| 0.80625 | 29.823 |
| 0.8069444444444445 | 29.823 |
| 0.8076388888888889 | 29.823 |
| 0.8083333333333332 | 25.419 |
| 0.8090277777777778 | 25.419 |
| 0.8097222222222222 | 25.419 |
| 0.8104166666666667 | 25.419 |
| 0.811111111111111 | 25.419 |
| 0.8118055555555556 | 25.419 |
| 0.8125 | 25.419 |
| 0.8131944444444444 | 25.419 |
| 0.813888888888889 | 25.419 |
| 0.8145833333333333 | 21.024 |
| 0.8152777777777778 | 21.024 |
| 0.8159722222222222 | 21.024 |
| 0.8166666666666668 | 21.024 |
| 0.8173611111111111 | 21.024 |
| 0.8180555555555555 | 21.024 |
| 0.81875 | 21.024 |
| 0.8194444444444445 | 21.024 |
| 0.8201388888888889 | 16.636 |
| 0.8208333333333333 | 16.636 |
| 0.8215277777777777 | 16.636 |
| 0.8222222222222223 | 16.636 |
| 0.8229166666666666 | 16.636 |
| 0.8236111111111111 | 16.636 |
| 0.8243055555555556 | 16.636 |
| 0.8250000000000001 | 12.257 |
| 0.8256944444444444 | 12.257 |
| 0.8263888888888888 | 12.257 |
| 0.8270833333333334 | 12.257 |
| 0.8277777777777778 | 12.257 |
| 0.8284722222222222 | 12.257 |
| 0.8291666666666666 | 12.257 |
| 0.8298611111111112 | 12.257 |
| 0.8305555555555556 | 7.887 |
| 0.8312499999999999 | 7.887 |
| 0.8319444444444444 | 7.887 |
| 0.8326388888888889 | 7.887 |
| 0.8333333333333334 | 7.887 |
| 0.8340277777777777 | 7.887 |
| 0.8347222222222223 | 7.887 |
| 0.8354166666666667 | 3.525 |
| 0.8361111111111111 | 3.525 |
| 0.8368055555555555 | 3.525 |
| 0.8375 | 3.525 |
| 0.8381944444444445 | 3.525 |
| 0.8388888888888889 | 3.525 |
| 0.8395833333333332 | 3.525 |
| 0.8402777777777778 | 3.525 |
| 0.8409722222222222 | 3.525 |
| 0.8416666666666667 | 3.525 |
| 0.842361111111111 | 0 |
| 0.8430555555555556 | 0 |
| 0.84375 | 0 |
| 0.8444444444444444 | 0 |
| 0.845138888888889 | 0 |
| 0.8458333333333333 | 0 |
| 0.8465277777777778 | 0 |
| 0.8472222222222222 | 0 |
| 0.8479166666666668 | 0 |
| 0.8486111111111111 | 0 |
| 0.8493055555555555 | 0 |
| 0.85 | 0 |
| 0.8506944444444445 | 0 |
| 0.8513888888888889 | 0 |
| 0.8520833333333333 | 0 |
| 0.8527777777777777 | 0 |
| 0.8534722222222223 | 0 |
| 0.8541666666666666 | 0 |
| 0.8548611111111111 | 0 |
| 0.8555555555555556 | 0 |
| 0.8562500000000001 | 0 |
| 0.8569444444444444 | 0 |
| 0.8576388888888888 | 0 |
| 0.8583333333333334 | 0 |
| 0.8590277777777778 | 0 |
| 0.8597222222222222 | 0 |
| 0.8604166666666666 | 0 |
| 0.8611111111111112 | 0 |
| 0.8618055555555556 | 0 |
| 0.8624999999999999 | 0 |
| 0.8631944444444444 | 0 |
| 0.8638888888888889 | 0 |
| 0.8645833333333334 | 0 |
| 0.8652777777777777 | 0 |
| 0.8659722222222223 | 0 |
| 0.8666666666666667 | 0 |
| 0.8673611111111111 | 0 |
| 0.8680555555555555 | 0 |
| 0.86875 | 0 |
| 0.8694444444444445 | 0 |
| 0.8701388888888889 | 0 |
| 0.8708333333333332 | 0 |
| 0.8715277777777778 | 0 |
| 0.8722222222222222 | 0 |
| 0.8729166666666667 | 0 |
| 0.873611111111111 | 0 |
| 0.8743055555555556 | 0 |
| 0.875 | 0 |
| 0.8756944444444444 | 0 |
| 0.876388888888889 | 0 |
| 0.8770833333333333 | 0 |
| 0.8777777777777778 | 0 |
| 0.8784722222222222 | 0 |
| 0.8791666666666668 | 0 |
| 0.8798611111111111 | 0 |
| 0.8805555555555555 | 0 |
| 0.88125 | 0 |
| 0.8819444444444445 | 0 |
| 0.8826388888888889 | 0 |
| 0.8833333333333333 | 0 |
| 0.8840277777777777 | 0 |
| 0.8847222222222223 | 0 |
| 0.8854166666666666 | 0 |
| 0.8861111111111111 | 0 |
| 0.8868055555555556 | 0 |
| 0.8875000000000001 | 0 |
| 0.8881944444444444 | 0 |
| 0.8888888888888888 | 0 |
| 0.8895833333333334 | 0 |
| 0.8902777777777778 | 0 |
| 0.8909722222222222 | 0 |
| 0.8916666666666666 | 0 |
| 0.8923611111111112 | 0 |
| 0.8930555555555556 | 0 |
| 0.8937499999999999 | 0 |
| 0.8944444444444444 | 0 |
| 0.8951388888888889 | 0 |
| 0.8958333333333334 | 0 |
| 0.8965277777777777 | 0 |
| 0.8972222222222223 | 0 |
| 0.8979166666666667 | 0 |
| 0.8986111111111111 | 0 |
| 0.8993055555555555 | 0 |
| 0.9 | 0 |
| 0.9006944444444445 | 0 |
| 0.9013888888888889 | 0 |
| 0.9020833333333332 | 0 |
| 0.9027777777777778 | 0 |
| 0.9034722222222222 | 0 |
| 0.9041666666666667 | 0 |
| 0.904861111111111 | 0 |
| 0.9055555555555556 | 0 |
| 0.90625 | 0 |
| 0.9069444444444444 | 0 |
| 0.907638888888889 | 0 |
| 0.9083333333333333 | 0 |
| 0.9090277777777778 | 0 |
| 0.9097222222222222 | 0 |
| 0.9104166666666668 | 0 |
| 0.9111111111111111 | 0 |
| 0.9118055555555555 | 0 |
| 0.9125 | 0 |
| 0.9131944444444445 | 0 |
| 0.9138888888888889 | 0 |
| 0.9145833333333333 | 0 |
| 0.9152777777777777 | 0 |
| 0.9159722222222223 | 0 |
| 0.9166666666666666 | 0 |
| 0.9173611111111111 | 0 |
| 0.9180555555555556 | 0 |
| 0.9187500000000001 | 0 |
| 0.9194444444444444 | 0 |
| 0.9201388888888888 | 0 |
| 0.9208333333333334 | 0 |
| 0.9215277777777778 | 0 |
| 0.9222222222222222 | 0 |
| 0.9229166666666666 | 0 |
| 0.9236111111111112 | 0 |
| 0.9243055555555556 | 0 |
| 0.9249999999999999 | 0 |
| 0.9256944444444444 | 0 |
| 0.9263888888888889 | 0 |
| 0.9270833333333334 | 0 |
| 0.9277777777777777 | 0 |
| 0.9284722222222223 | 0 |
| 0.9291666666666667 | 0 |
| 0.9298611111111111 | 0 |
| 0.9305555555555555 | 0 |
| 0.93125 | 0 |
| 0.9319444444444445 | 0 |
| 0.9326388888888889 | 0 |
| 0.9333333333333332 | 0 |
| 0.9340277777777778 | 0 |
| 0.9347222222222222 | 0 |
| 0.9354166666666667 | 0 |
| 0.936111111111111 | 0 |
| 0.9368055555555556 | 0 |
| 0.9375 | 0 |
| 0.9381944444444444 | 0 |
| 0.938888888888889 | 0 |
| 0.9395833333333333 | 0 |
| 0.9402777777777778 | 0 |
| 0.9409722222222222 | 0 |
| 0.9416666666666668 | 0 |
| 0.9423611111111111 | 0 |
| 0.9430555555555555 | 0 |
| 0.94375 | 0 |
| 0.9444444444444445 | 0 |
| 0.9451388888888889 | 0 |
| 0.9458333333333333 | 0 |
| 0.9465277777777777 | 0 |
| 0.9472222222222223 | 0 |
| 0.9479166666666666 | 0 |
| 0.9486111111111111 | 0 |
| 0.9493055555555556 | 0 |
| 0.9500000000000001 | 0 |
| 0.9506944444444444 | 0 |
| 0.9513888888888888 | 0 |
| 0.9520833333333334 | 0 |
| 0.9527777777777778 | 0 |
| 0.9534722222222222 | 0 |
| 0.9541666666666666 | 0 |
| 0.9548611111111112 | 0 |
| 0.9555555555555556 | 0 |
| 0.9562499999999999 | 0 |
| 0.9569444444444444 | 0 |
| 0.9576388888888889 | 0 |
| 0.9583333333333334 | 0 |
| 0.9590277777777777 | 0 |
| 0.9597222222222223 | 0 |
| 0.9604166666666667 | 0 |
| 0.9611111111111111 | 0 |
| 0.9618055555555555 | 0 |
| 0.9625 | 0 |
| 0.9631944444444445 | 0 |
| 0.9638888888888889 | 0 |
| 0.9645833333333332 | 0 |
| 0.9652777777777778 | 0 |
| 0.9659722222222222 | 0 |
| 0.9666666666666667 | 0 |
| 0.967361111111111 | 0 |
| 0.9680555555555556 | 0 |
| 0.96875 | 0 |
| 0.9694444444444444 | 0 |
| 0.970138888888889 | 0 |
| 0.9708333333333333 | 0 |
| 0.9715277777777778 | 0 |
| 0.9722222222222222 | 0 |
| 0.9729166666666668 | 0 |
| 0.9736111111111111 | 0 |
| 0.9743055555555555 | 0 |
| 0.975 | 0 |
| 0.9756944444444445 | 0 |
| 0.9763888888888889 | 0 |
| 0.9770833333333333 | 0 |
| 0.9777777777777777 | 0 |
| 0.9784722222222223 | 0 |
| 0.9791666666666666 | 0 |
| 0.9798611111111111 | 0 |
| 0.9805555555555556 | 0 |
| 0.9812500000000001 | 0 |
| 0.9819444444444444 | 0 |
| 0.9826388888888888 | 0 |
| 0.9833333333333334 | 0 |
| 0.9840277777777778 | 0 |
| 0.9847222222222222 | 0 |
| 0.9854166666666666 | 0 |
| 0.9861111111111112 | 0 |
| 0.9868055555555556 | 0 |
| 0.9874999999999999 | 0 |
| 0.9881944444444444 | 0 |
| 0.9888888888888889 | 0 |
| 0.9895833333333334 | 0 |
| 0.9902777777777777 | 0 |
| 0.9909722222222223 | 0 |
| 0.9916666666666667 | 0 |
| 0.9923611111111111 | 0 |
| 0.9930555555555555 | 0 |
| 0.99375 | 0 |
| 0.9944444444444445 | 0 |
| 0.9951388888888889 | 0 |
| 0.9958333333333332 | 0 |
| 0.9965277777777778 | 0 |
| 0.9972222222222222 | 0 |
| 0.9979166666666667 | 0 |
| 0.998611111111111 | 0 |
| 0.9993055555555556 | 0 |